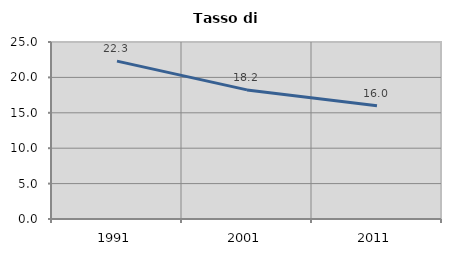
| Category | Tasso di disoccupazione   |
|---|---|
| 1991.0 | 22.296 |
| 2001.0 | 18.233 |
| 2011.0 | 15.982 |